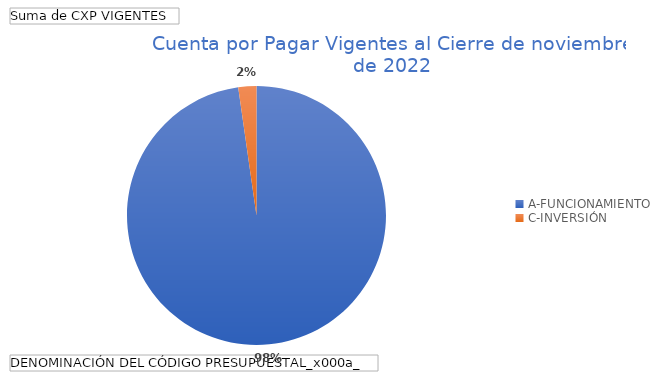
| Category | Total |
|---|---|
| A-FUNCIONAMIENTO | 7893.785 |
| C-INVERSIÓN | 182.429 |